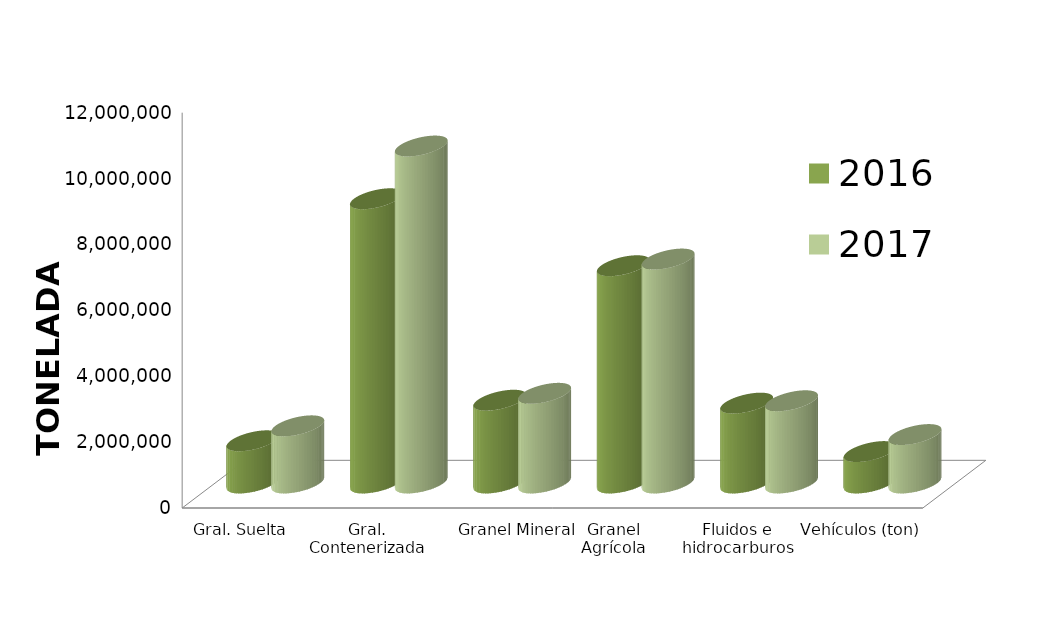
| Category | 2016 | 2017 |
|---|---|---|
| Gral. Suelta | 1281628.911 | 1735694.29 |
| Gral. Contenerizada | 8628512.568 | 10228528.966 |
| Granel Mineral | 2513269.148 | 2722666.885 |
| Granel Agrícola | 6595560.905 | 6798187.295 |
| Fluidos e hidrocarburos | 2424436.585 | 2496946.637 |
| Vehículos (ton) | 954170.39 | 1470487.846 |